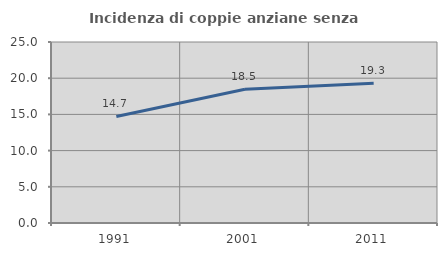
| Category | Incidenza di coppie anziane senza figli  |
|---|---|
| 1991.0 | 14.715 |
| 2001.0 | 18.462 |
| 2011.0 | 19.297 |